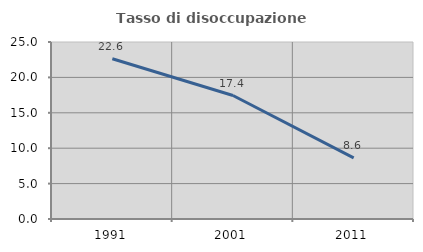
| Category | Tasso di disoccupazione giovanile  |
|---|---|
| 1991.0 | 22.642 |
| 2001.0 | 17.442 |
| 2011.0 | 8.642 |